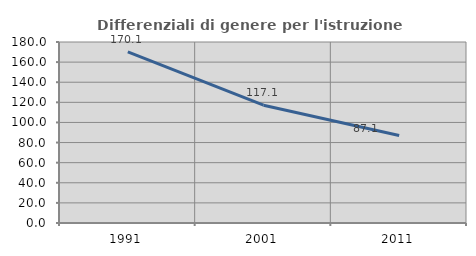
| Category | Differenziali di genere per l'istruzione superiore |
|---|---|
| 1991.0 | 170.139 |
| 2001.0 | 117.122 |
| 2011.0 | 87.099 |